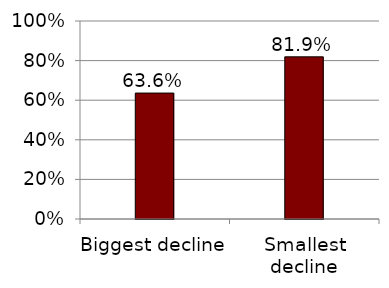
| Category | Series 0 |
|---|---|
| Biggest decline | 0.636 |
| Smallest decline | 0.819 |